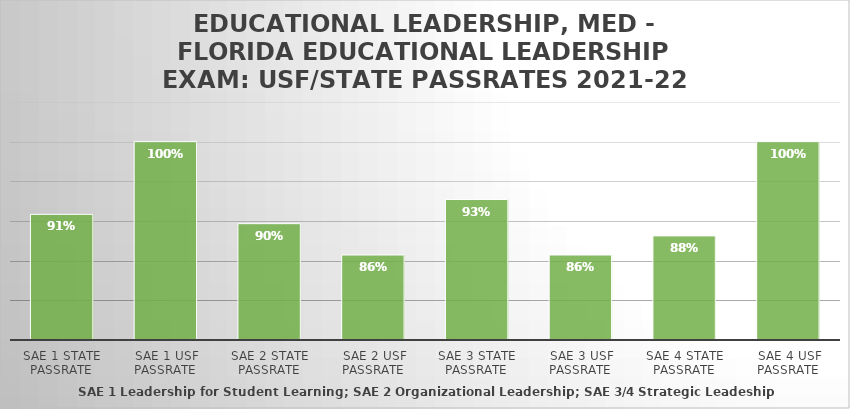
| Category | Educational Leadership, MED |
|---|---|
| SAE 1 State Passrate | 0.908 |
| SAE 1 USF Passrate | 1 |
| SAE 2 State Passrate | 0.897 |
| SAE 2 USF Passrate | 0.857 |
| SAE 3 State Passrate | 0.927 |
| SAE 3 USF Passrate | 0.857 |
| SAE 4 State Passrate | 0.881 |
| SAE 4 USF Passrate | 1 |